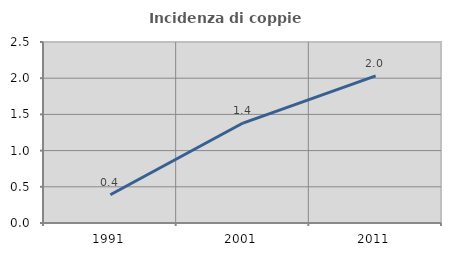
| Category | Incidenza di coppie miste |
|---|---|
| 1991.0 | 0.391 |
| 2001.0 | 1.381 |
| 2011.0 | 2.033 |